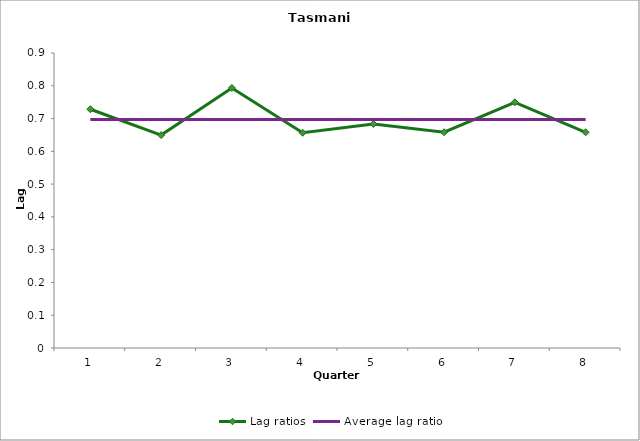
| Category | Lag ratios | Average lag ratio |
|---|---|---|
| 0 | 0.728 | 0.697 |
| 1 | 0.649 | 0.697 |
| 2 | 0.793 | 0.697 |
| 3 | 0.657 | 0.697 |
| 4 | 0.684 | 0.697 |
| 5 | 0.658 | 0.697 |
| 6 | 0.749 | 0.697 |
| 7 | 0.658 | 0.697 |